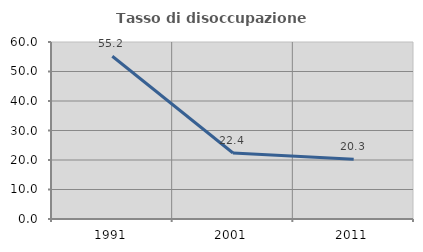
| Category | Tasso di disoccupazione giovanile  |
|---|---|
| 1991.0 | 55.155 |
| 2001.0 | 22.388 |
| 2011.0 | 20.253 |